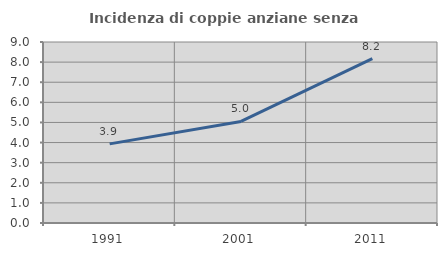
| Category | Incidenza di coppie anziane senza figli  |
|---|---|
| 1991.0 | 3.935 |
| 2001.0 | 5.049 |
| 2011.0 | 8.176 |